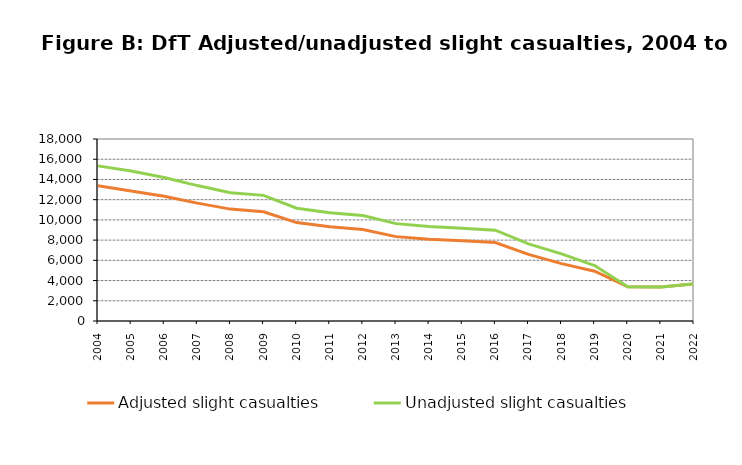
| Category | Adjusted slight casualties | Unadjusted slight casualties |
|---|---|---|
| 2004.0 | 13380 | 15342 |
| 2005.0 | 12861 | 14831 |
| 2006.0 | 12330 | 14199 |
| 2007.0 | 11660 | 13393 |
| 2008.0 | 11066 | 12691 |
| 2009.0 | 10796 | 12424 |
| 2010.0 | 9735 | 11152 |
| 2011.0 | 9325 | 10699 |
| 2012.0 | 9049 | 10442 |
| 2013.0 | 8344 | 9631 |
| 2014.0 | 8078 | 9339 |
| 2015.0 | 7931 | 9176 |
| 2016.0 | 7763 | 8980 |
| 2017.0 | 6593 | 7633 |
| 2018.0 | 5677 | 6635 |
| 2019.0 | 4927 | 5486 |
| 2020.0 | 3386 | 3386 |
| 2021.0 | 3356 | 3356 |
| 2022.0 | 3672 | 3672 |